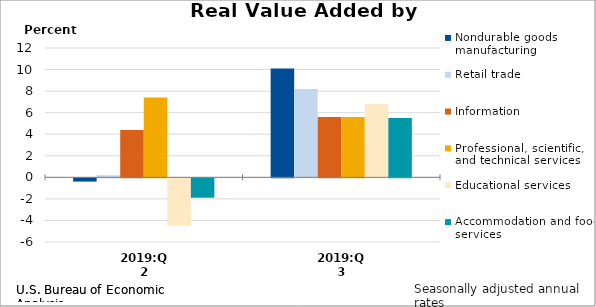
| Category | Nondurable goods manufacturing | Retail trade | Information | Professional, scientific, and technical services | Educational services | Accommodation and food services |
|---|---|---|---|---|---|---|
| 2019:Q2 | -0.3 | 0.2 | 4.4 | 7.4 | -4.4 | -1.8 |
| 2019:Q3 | 10.1 | 8.2 | 5.6 | 5.6 | 6.8 | 5.5 |